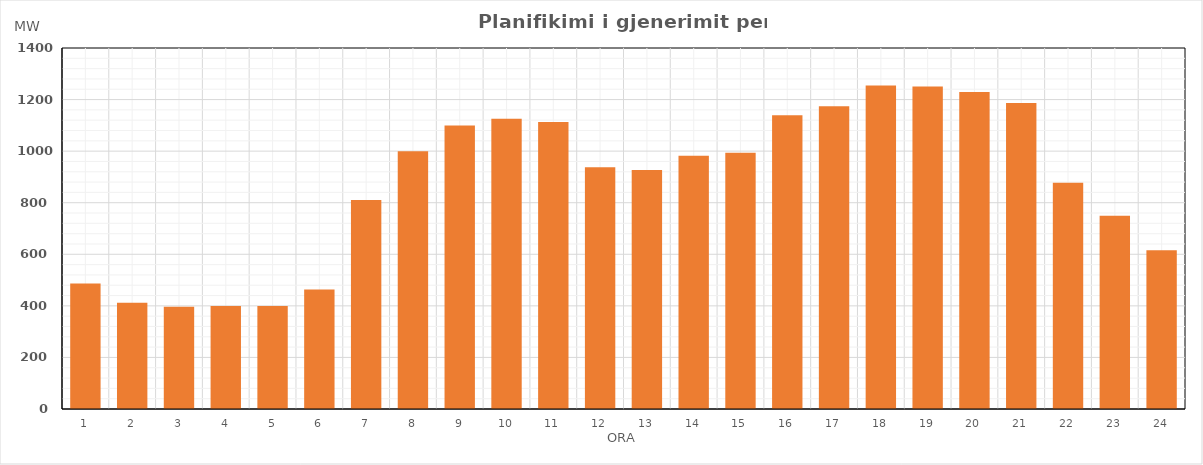
| Category | Max (MW) |
|---|---|
| 0 | 486.87 |
| 1 | 412.2 |
| 2 | 397 |
| 3 | 399 |
| 4 | 399 |
| 5 | 463.4 |
| 6 | 810.39 |
| 7 | 999.68 |
| 8 | 1099.76 |
| 9 | 1125.34 |
| 10 | 1112.62 |
| 11 | 937.84 |
| 12 | 926.92 |
| 13 | 982.58 |
| 14 | 993.78 |
| 15 | 1138.9 |
| 16 | 1173.76 |
| 17 | 1254.96 |
| 18 | 1250.99 |
| 19 | 1228.94 |
| 20 | 1186.92 |
| 21 | 877.5 |
| 22 | 749.63 |
| 23 | 616.1 |